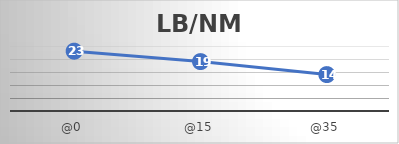
| Category | LB/NM |
|---|---|
| @0 | 23 |
| @15 | 19 |
| @35 | 14 |